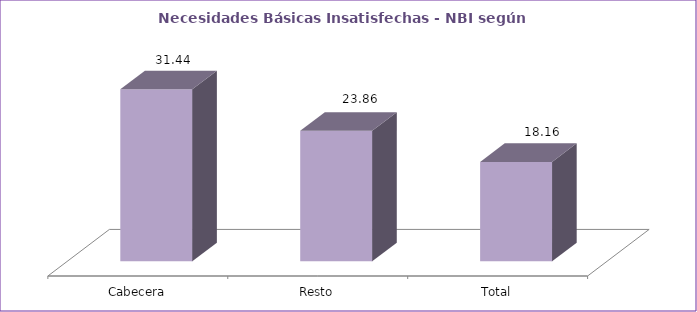
| Category | Series 0 |
|---|---|
| Cabecera | 31.44 |
| Resto | 23.86 |
| Total | 18.16 |